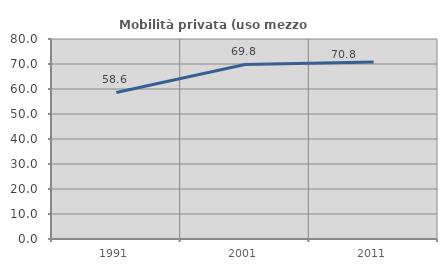
| Category | Mobilità privata (uso mezzo privato) |
|---|---|
| 1991.0 | 58.615 |
| 2001.0 | 69.822 |
| 2011.0 | 70.841 |